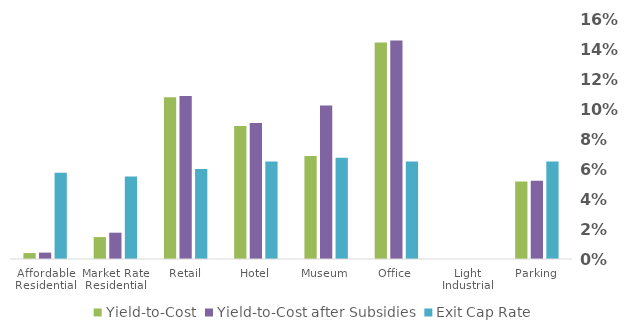
| Category | Yield-to-Cost | Yield-to-Cost after Subsidies | Exit Cap Rate |
|---|---|---|---|
| Affordable Residential | 0.004 | 0.004 | 0.058 |
| Market Rate Residential | 0.015 | 0.018 | 0.055 |
| Retail | 0.108 | 0.109 | 0.06 |
| Hotel | 0.089 | 0.091 | 0.065 |
| Museum | 0.069 | 0.102 | 0.068 |
| Office | 0.144 | 0.146 | 0.065 |
| Light Industrial | 0 | 0 | 0 |
| Parking | 0.052 | 0.052 | 0.065 |